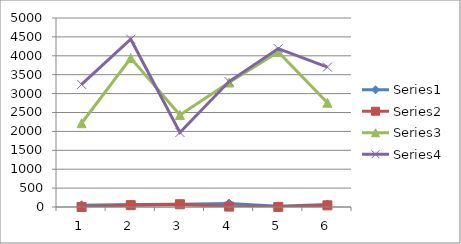
| Category | Series 0 | Series 1 | Series 2 | Series 3 |
|---|---|---|---|---|
| 0 | 46 | 1 | 2216 | 3245 |
| 1 | 69 | 49 | 3941 | 4438 |
| 2 | 76 | 73 | 2436 | 1972 |
| 3 | 92 | 11 | 3292 | 3318 |
| 4 | 18 | 2 | 4100 | 4190 |
| 5 | 68 | 44 | 2758 | 3702 |